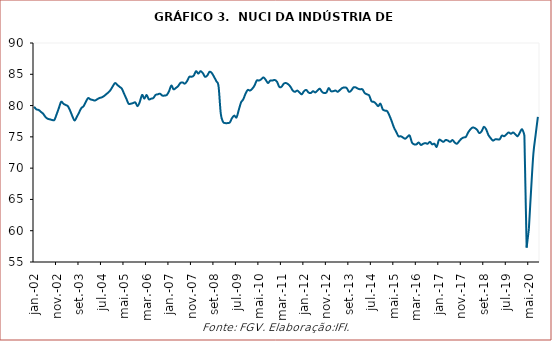
| Category | Nuci |
|---|---|
| 2002-01-01 | 79.8 |
| 2002-02-01 | 79.4 |
| 2002-03-01 | 79.3 |
| 2002-04-01 | 79 |
| 2002-05-01 | 78.7 |
| 2002-06-01 | 78.2 |
| 2002-07-01 | 77.9 |
| 2002-08-01 | 77.8 |
| 2002-09-01 | 77.7 |
| 2002-10-01 | 77.7 |
| 2002-11-01 | 78.6 |
| 2002-12-01 | 79.6 |
| 2003-01-01 | 80.6 |
| 2003-02-01 | 80.3 |
| 2003-03-01 | 80.1 |
| 2003-04-01 | 79.9 |
| 2003-05-01 | 79.2 |
| 2003-06-01 | 78.3 |
| 2003-07-01 | 77.6 |
| 2003-08-01 | 78.2 |
| 2003-09-01 | 78.9 |
| 2003-10-01 | 79.6 |
| 2003-11-01 | 79.9 |
| 2003-12-01 | 80.6 |
| 2004-01-01 | 81.2 |
| 2004-02-01 | 81 |
| 2004-03-01 | 80.9 |
| 2004-04-01 | 80.8 |
| 2004-05-01 | 81 |
| 2004-06-01 | 81.2 |
| 2004-07-01 | 81.3 |
| 2004-08-01 | 81.5 |
| 2004-09-01 | 81.8 |
| 2004-10-01 | 82.1 |
| 2004-11-01 | 82.5 |
| 2004-12-01 | 83.1 |
| 2005-01-01 | 83.6 |
| 2005-02-01 | 83.3 |
| 2005-03-01 | 83 |
| 2005-04-01 | 82.7 |
| 2005-05-01 | 81.9 |
| 2005-06-01 | 81.1 |
| 2005-07-01 | 80.3 |
| 2005-08-01 | 80.3 |
| 2005-09-01 | 80.4 |
| 2005-10-01 | 80.5 |
| 2005-11-01 | 79.9 |
| 2005-12-01 | 80.6 |
| 2006-01-01 | 81.7 |
| 2006-02-01 | 81.1 |
| 2006-03-01 | 81.7 |
| 2006-04-01 | 81 |
| 2006-05-01 | 81.1 |
| 2006-06-01 | 81.2 |
| 2006-07-01 | 81.7 |
| 2006-08-01 | 81.8 |
| 2006-09-01 | 81.9 |
| 2006-10-01 | 81.6 |
| 2006-11-01 | 81.6 |
| 2006-12-01 | 81.7 |
| 2007-01-01 | 82.3 |
| 2007-02-01 | 83.2 |
| 2007-03-01 | 82.6 |
| 2007-04-01 | 82.8 |
| 2007-05-01 | 83.1 |
| 2007-06-01 | 83.6 |
| 2007-07-01 | 83.7 |
| 2007-08-01 | 83.5 |
| 2007-09-01 | 83.9 |
| 2007-10-01 | 84.6 |
| 2007-11-01 | 84.6 |
| 2007-12-01 | 84.8 |
| 2008-01-01 | 85.5 |
| 2008-02-01 | 85.1 |
| 2008-03-01 | 85.5 |
| 2008-04-01 | 85.2 |
| 2008-05-01 | 84.6 |
| 2008-06-01 | 84.8 |
| 2008-07-01 | 85.4 |
| 2008-08-01 | 85.2 |
| 2008-09-01 | 84.6 |
| 2008-10-01 | 83.9 |
| 2008-11-01 | 83.1 |
| 2008-12-01 | 78.7 |
| 2009-01-01 | 77.4 |
| 2009-02-01 | 77.2 |
| 2009-03-01 | 77.2 |
| 2009-04-01 | 77.3 |
| 2009-05-01 | 78 |
| 2009-06-01 | 78.4 |
| 2009-07-01 | 78.1 |
| 2009-08-01 | 79.3 |
| 2009-09-01 | 80.5 |
| 2009-10-01 | 81 |
| 2009-11-01 | 81.9 |
| 2009-12-01 | 82.5 |
| 2010-01-01 | 82.4 |
| 2010-02-01 | 82.7 |
| 2010-03-01 | 83.2 |
| 2010-04-01 | 84 |
| 2010-05-01 | 84 |
| 2010-06-01 | 84.2 |
| 2010-07-01 | 84.5 |
| 2010-08-01 | 84.1 |
| 2010-09-01 | 83.6 |
| 2010-10-01 | 84 |
| 2010-11-01 | 84 |
| 2010-12-01 | 84.1 |
| 2011-01-01 | 83.8 |
| 2011-02-01 | 83 |
| 2011-03-01 | 83 |
| 2011-04-01 | 83.5 |
| 2011-05-01 | 83.6 |
| 2011-06-01 | 83.4 |
| 2011-07-01 | 83 |
| 2011-08-01 | 82.4 |
| 2011-09-01 | 82.2 |
| 2011-10-01 | 82.4 |
| 2011-11-01 | 82.1 |
| 2011-12-01 | 81.8 |
| 2012-01-01 | 82.3 |
| 2012-02-01 | 82.5 |
| 2012-03-01 | 82.1 |
| 2012-04-01 | 82 |
| 2012-05-01 | 82.3 |
| 2012-06-01 | 82.1 |
| 2012-07-01 | 82.4 |
| 2012-08-01 | 82.7 |
| 2012-09-01 | 82.2 |
| 2012-10-01 | 82 |
| 2012-11-01 | 82.1 |
| 2012-12-01 | 82.8 |
| 2013-01-01 | 82.3 |
| 2013-02-01 | 82.3 |
| 2013-03-01 | 82.4 |
| 2013-04-01 | 82.2 |
| 2013-05-01 | 82.5 |
| 2013-06-01 | 82.8 |
| 2013-07-01 | 82.9 |
| 2013-08-01 | 82.8 |
| 2013-09-01 | 82.2 |
| 2013-10-01 | 82.4 |
| 2013-11-01 | 82.9 |
| 2013-12-01 | 82.9 |
| 2014-01-01 | 82.7 |
| 2014-02-01 | 82.6 |
| 2014-03-01 | 82.6 |
| 2014-04-01 | 82 |
| 2014-05-01 | 81.8 |
| 2014-06-01 | 81.6 |
| 2014-07-01 | 80.7 |
| 2014-08-01 | 80.6 |
| 2014-09-01 | 80.3 |
| 2014-10-01 | 79.9 |
| 2014-11-01 | 80.3 |
| 2014-12-01 | 79.4 |
| 2015-01-01 | 79.2 |
| 2015-02-01 | 79.1 |
| 2015-03-01 | 78.4 |
| 2015-04-01 | 77.5 |
| 2015-05-01 | 76.5 |
| 2015-06-01 | 75.8 |
| 2015-07-01 | 75.1 |
| 2015-08-01 | 75.1 |
| 2015-09-01 | 74.9 |
| 2015-10-01 | 74.7 |
| 2015-11-01 | 75 |
| 2015-12-01 | 75.2 |
| 2016-01-01 | 74.1 |
| 2016-02-01 | 73.8 |
| 2016-03-01 | 73.8 |
| 2016-04-01 | 74.1 |
| 2016-05-01 | 73.7 |
| 2016-06-01 | 73.9 |
| 2016-07-01 | 74 |
| 2016-08-01 | 73.9 |
| 2016-09-01 | 74.2 |
| 2016-10-01 | 73.8 |
| 2016-11-01 | 73.9 |
| 2016-12-01 | 73.4 |
| 2017-01-01 | 74.5 |
| 2017-02-01 | 74.4 |
| 2017-03-01 | 74.2 |
| 2017-04-01 | 74.5 |
| 2017-05-01 | 74.4 |
| 2017-06-01 | 74.2 |
| 2017-07-01 | 74.5 |
| 2017-08-01 | 74.1 |
| 2017-09-01 | 73.9 |
| 2017-10-01 | 74.3 |
| 2017-11-01 | 74.7 |
| 2017-12-01 | 74.9 |
| 2018-01-01 | 75 |
| 2018-02-01 | 75.7 |
| 2018-03-01 | 76.2 |
| 2018-04-01 | 76.5 |
| 2018-05-01 | 76.4 |
| 2018-06-01 | 76.1 |
| 2018-07-01 | 75.6 |
| 2018-08-01 | 75.9 |
| 2018-09-01 | 76.6 |
| 2018-10-01 | 76.2 |
| 2018-11-01 | 75.3 |
| 2018-12-01 | 74.8 |
| 2019-01-01 | 74.4 |
| 2019-02-01 | 74.6 |
| 2019-03-01 | 74.6 |
| 2019-04-01 | 74.6 |
| 2019-05-01 | 75.2 |
| 2019-06-01 | 75.1 |
| 2019-07-01 | 75.4 |
| 2019-08-01 | 75.7 |
| 2019-09-01 | 75.5 |
| 2019-10-01 | 75.7 |
| 2019-11-01 | 75.4 |
| 2019-12-01 | 75.1 |
| 2020-01-01 | 75.7 |
| 2020-02-01 | 76.2 |
| 2020-03-01 | 75.3 |
| 2020-04-01 | 57.3 |
| 2020-05-01 | 60.3 |
| 2020-06-01 | 66.6 |
| 2020-07-01 | 72.3 |
| 2020-08-01 | 75.3 |
| 2020-09-01 | 78.2 |